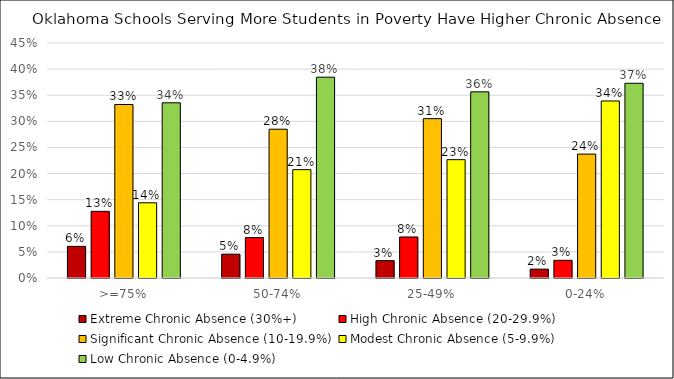
| Category | Extreme Chronic Absence (30%+) | High Chronic Absence (20-29.9%) | Significant Chronic Absence (10-19.9%) | Modest Chronic Absence (5-9.9%) | Low Chronic Absence (0-4.9%) |
|---|---|---|---|---|---|
| >=75% | 0.061 | 0.128 | 0.332 | 0.144 | 0.336 |
| 50-74% | 0.046 | 0.077 | 0.285 | 0.207 | 0.385 |
| 25-49% | 0.033 | 0.079 | 0.305 | 0.227 | 0.356 |
| 0-24% | 0.017 | 0.034 | 0.237 | 0.339 | 0.373 |